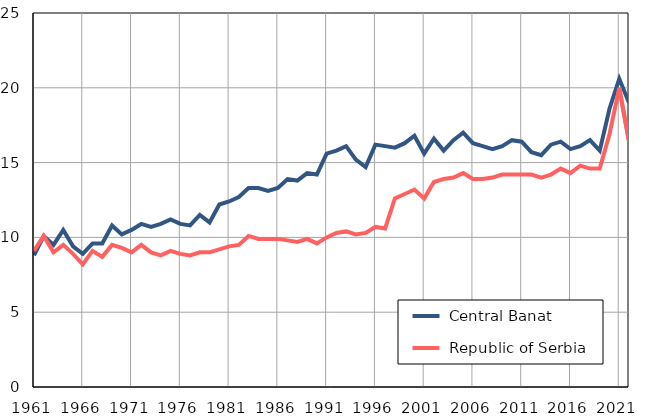
| Category |  Central Banat |  Republic of Serbia |
|---|---|---|
| 1961.0 | 8.8 | 9.1 |
| 1962.0 | 10.1 | 10.1 |
| 1963.0 | 9.5 | 9 |
| 1964.0 | 10.5 | 9.5 |
| 1965.0 | 9.4 | 8.9 |
| 1966.0 | 8.9 | 8.2 |
| 1967.0 | 9.6 | 9.1 |
| 1968.0 | 9.6 | 8.7 |
| 1969.0 | 10.8 | 9.5 |
| 1970.0 | 10.2 | 9.3 |
| 1971.0 | 10.5 | 9 |
| 1972.0 | 10.9 | 9.5 |
| 1973.0 | 10.7 | 9 |
| 1974.0 | 10.9 | 8.8 |
| 1975.0 | 11.2 | 9.1 |
| 1976.0 | 10.9 | 8.9 |
| 1977.0 | 10.8 | 8.8 |
| 1978.0 | 11.5 | 9 |
| 1979.0 | 11 | 9 |
| 1980.0 | 12.2 | 9.2 |
| 1981.0 | 12.4 | 9.4 |
| 1982.0 | 12.7 | 9.5 |
| 1983.0 | 13.3 | 10.1 |
| 1984.0 | 13.3 | 9.9 |
| 1985.0 | 13.1 | 9.9 |
| 1986.0 | 13.3 | 9.9 |
| 1987.0 | 13.9 | 9.8 |
| 1988.0 | 13.8 | 9.7 |
| 1989.0 | 14.3 | 9.9 |
| 1990.0 | 14.2 | 9.6 |
| 1991.0 | 15.6 | 10 |
| 1992.0 | 15.8 | 10.3 |
| 1993.0 | 16.1 | 10.4 |
| 1994.0 | 15.2 | 10.2 |
| 1995.0 | 14.7 | 10.3 |
| 1996.0 | 16.2 | 10.7 |
| 1997.0 | 16.1 | 10.6 |
| 1998.0 | 16 | 12.6 |
| 1999.0 | 16.3 | 12.9 |
| 2000.0 | 16.8 | 13.2 |
| 2001.0 | 15.6 | 12.6 |
| 2002.0 | 16.6 | 13.7 |
| 2003.0 | 15.8 | 13.9 |
| 2004.0 | 16.5 | 14 |
| 2005.0 | 17 | 14.3 |
| 2006.0 | 16.3 | 13.9 |
| 2007.0 | 16.1 | 13.9 |
| 2008.0 | 15.9 | 14 |
| 2009.0 | 16.1 | 14.2 |
| 2010.0 | 16.5 | 14.2 |
| 2011.0 | 16.4 | 14.2 |
| 2012.0 | 15.7 | 14.2 |
| 2013.0 | 15.5 | 14 |
| 2014.0 | 16.2 | 14.2 |
| 2015.0 | 16.4 | 14.6 |
| 2016.0 | 15.9 | 14.3 |
| 2017.0 | 16.1 | 14.8 |
| 2018.0 | 16.5 | 14.6 |
| 2019.0 | 15.8 | 14.6 |
| 2020.0 | 18.6 | 16.9 |
| 2021.0 | 20.6 | 20 |
| 2022.0 | 19 | 16.4 |